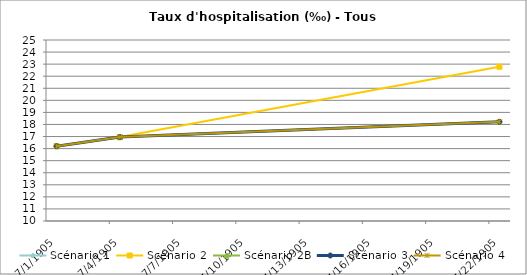
| Category | Scénario 1 | Scénario 2 | Scénario 2B | Scénario 3 | Scénario 4 |
|---|---|---|---|---|---|
| 2009.0 | 16.202 | 16.202 | 16.202 | 16.202 | 16.202 |
| 2012.0 | 16.953 | 16.953 | 16.953 | 16.953 | 16.953 |
| 2030.0 | 18.222 | 22.785 | 18.222 | 18.222 | 18.222 |